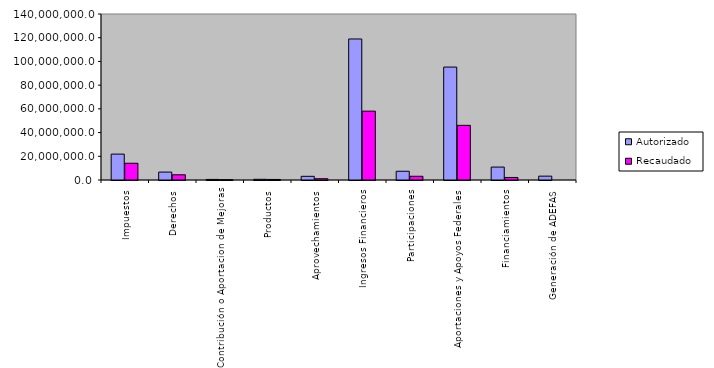
| Category | Autorizado | Recaudado |
|---|---|---|
| 0 | 21836342.2 | 14118619 |
| 1 | 6668975.9 | 4392496.2 |
| 2 | 486870.5 | 263940.5 |
| 3 | 591887.6 | 455306.2 |
| 4 | 3107507 | 1075694.3 |
| 5 | 118941762.4 | 58078222.2 |
| 6 | 7368150.7 | 3142096.2 |
| 7 | 95243430.1 | 46105395.1 |
| 8 | 10909591.9 | 2122815.2 |
| 9 | 3243691 | 0 |